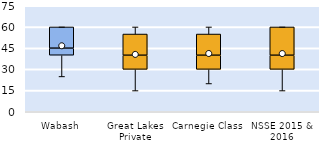
| Category | 25th | 50th | 75th |
|---|---|---|---|
| Wabash | 40 | 5 | 15 |
| Great Lakes Private | 30 | 10 | 15 |
| Carnegie Class | 30 | 10 | 15 |
| NSSE 2015 & 2016 | 30 | 10 | 20 |